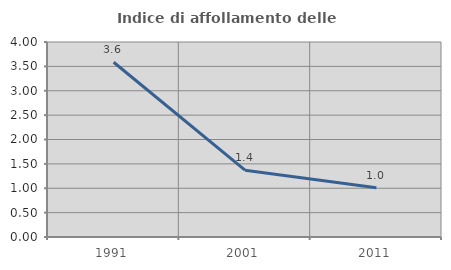
| Category | Indice di affollamento delle abitazioni  |
|---|---|
| 1991.0 | 3.585 |
| 2001.0 | 1.37 |
| 2011.0 | 1.011 |